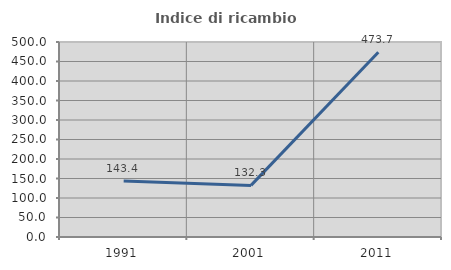
| Category | Indice di ricambio occupazionale  |
|---|---|
| 1991.0 | 143.382 |
| 2001.0 | 132.292 |
| 2011.0 | 473.684 |